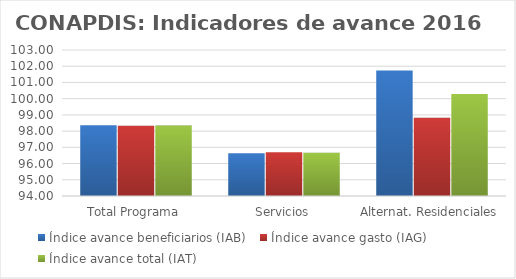
| Category | Índice avance beneficiarios (IAB)  | Índice avance gasto (IAG) | Índice avance total (IAT)  |
|---|---|---|---|
| Total Programa | 98.355 | 98.331 | 98.343 |
| Servicios | 96.634 | 96.698 | 96.666 |
| Alternat. Residenciales | 101.744 | 98.83 | 100.287 |